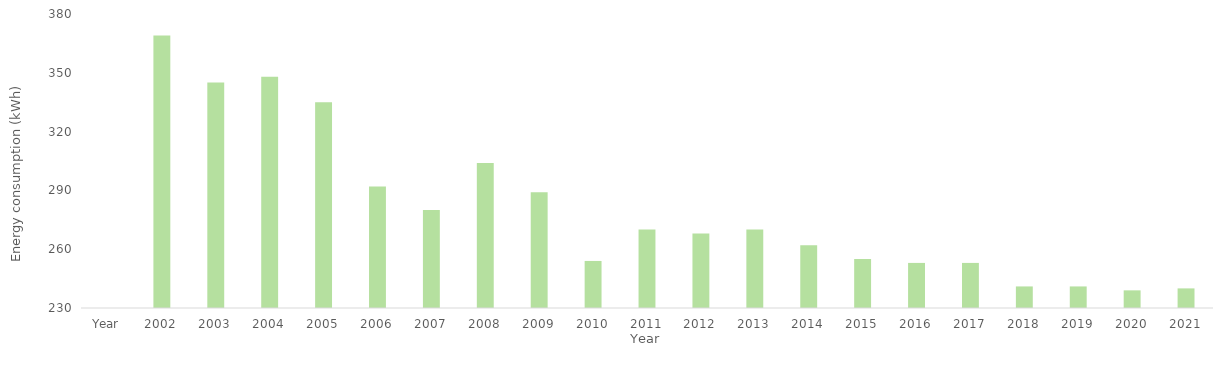
| Category | Series 0 |
|---|---|
| Year | 0 |
| 2002 | 369 |
| 2003 | 345 |
| 2004 | 348 |
| 2005 | 335 |
| 2006 | 292 |
| 2007 | 280 |
| 2008 | 304 |
| 2009 | 289 |
| 2010 | 254 |
| 2011 | 270 |
| 2012 | 268 |
| 2013 | 270 |
| 2014 | 262 |
| 2015 | 255 |
| 2016 | 253 |
| 2017 | 253 |
| 2018 | 241 |
| 2019 | 241 |
| 2020 | 239 |
| 2021 | 240 |